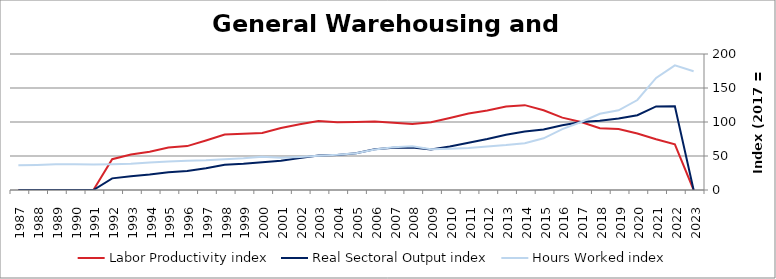
| Category | Labor Productivity index | Real Sectoral Output index | Hours Worked index |
|---|---|---|---|
| 2023.0 | 0 | 0 | 174.686 |
| 2022.0 | 67.111 | 123.043 | 183.343 |
| 2021.0 | 74.623 | 122.947 | 164.758 |
| 2020.0 | 83.105 | 109.973 | 132.33 |
| 2019.0 | 89.771 | 105.244 | 117.236 |
| 2018.0 | 90.892 | 101.894 | 112.105 |
| 2017.0 | 100 | 100 | 100 |
| 2016.0 | 106.425 | 95.26 | 89.509 |
| 2015.0 | 117.214 | 89.074 | 75.993 |
| 2014.0 | 124.774 | 85.969 | 68.899 |
| 2013.0 | 122.794 | 81.151 | 66.087 |
| 2012.0 | 116.982 | 74.963 | 64.081 |
| 2011.0 | 112.494 | 69.515 | 61.795 |
| 2010.0 | 105.782 | 64.047 | 60.546 |
| 2009.0 | 99.56 | 59.635 | 59.899 |
| 2008.0 | 96.906 | 62.489 | 64.485 |
| 2007.0 | 98.881 | 62.31 | 63.015 |
| 2006.0 | 100.687 | 59.923 | 59.515 |
| 2005.0 | 99.866 | 54.052 | 54.125 |
| 2004.0 | 99.543 | 51.552 | 51.788 |
| 2003.0 | 101.377 | 50.899 | 50.207 |
| 2002.0 | 96.667 | 47.052 | 48.674 |
| 2001.0 | 91.059 | 43.078 | 47.308 |
| 2000.0 | 83.754 | 40.81 | 48.726 |
| 1999.0 | 82.631 | 38.559 | 46.664 |
| 1998.0 | 81.576 | 36.965 | 45.314 |
| 1997.0 | 72.756 | 31.922 | 43.876 |
| 1996.0 | 64.528 | 27.817 | 43.108 |
| 1995.0 | 62.337 | 26.182 | 42.001 |
| 1994.0 | 56.293 | 22.731 | 40.38 |
| 1993.0 | 52.064 | 20.069 | 38.546 |
| 1992.0 | 45.361 | 17.11 | 37.719 |
| 1991.0 | 0 | 0 | 37.472 |
| 1990.0 | 0 | 0 | 37.966 |
| 1989.0 | 0 | 0 | 37.78 |
| 1988.0 | 0 | 0 | 36.918 |
| 1987.0 | 0 | 0 | 36.295 |